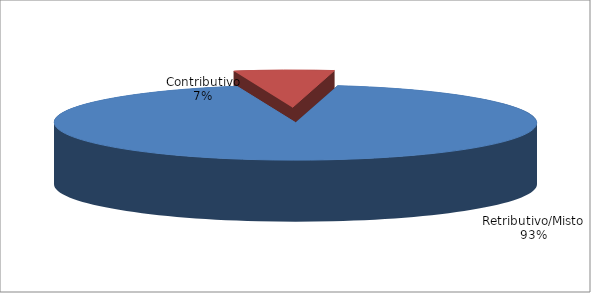
| Category | serie2 |
|---|---|
| Retributivo/Misto | 220354 |
| Contributivo | 15780 |